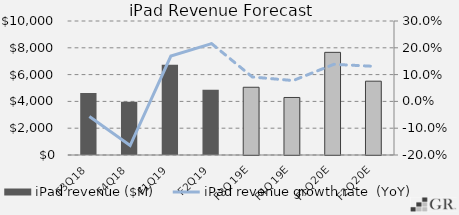
| Category | iPad revenue ($M) |
|---|---|
|  F3Q18  | 4634 |
|  F4Q18  | 3983 |
|  F1Q19  | 6729 |
|  F2Q19  | 4872 |
|  F3Q19E  | 5055.75 |
|  F4Q19E  | 4292.829 |
|  F1Q20E  | 7660.315 |
|  F2Q20E  | 5508.736 |